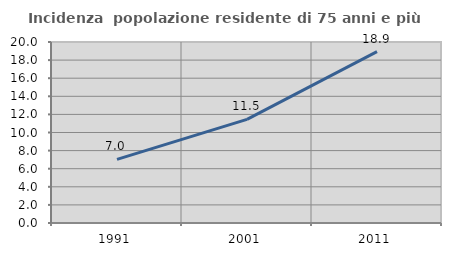
| Category | Incidenza  popolazione residente di 75 anni e più |
|---|---|
| 1991.0 | 7.029 |
| 2001.0 | 11.452 |
| 2011.0 | 18.942 |